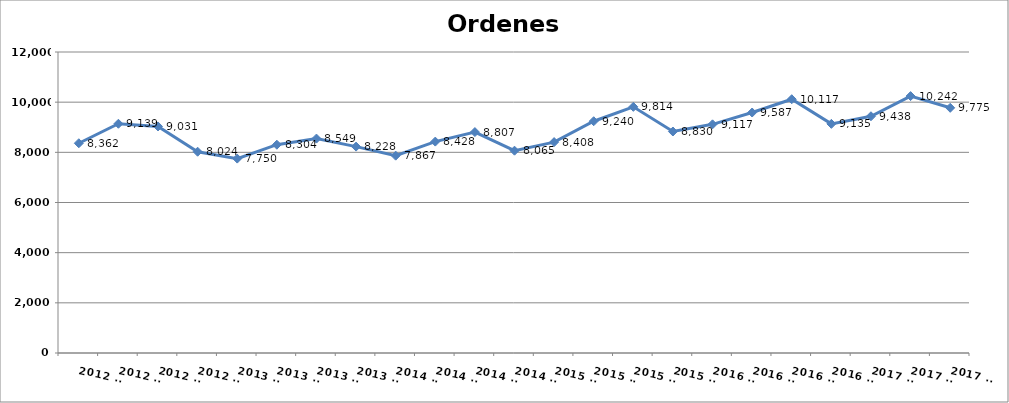
| Category | Ordenes incoadas |
|---|---|
| 2012 T1 | 8362 |
| 2012 T2 | 9139 |
| 2012 T3 | 9031 |
| 2012 T4 | 8024 |
| 2013 T1 | 7750 |
| 2013 T2 | 8304 |
| 2013 T3 | 8549 |
| 2013 T4 | 8228 |
| 2014 T1 | 7867 |
| 2014 T2 | 8428 |
| 2014 T3 | 8807 |
| 2014 T4 | 8065 |
| 2015 T1 | 8408 |
| 2015 T2 | 9240 |
| 2015 T3 | 9814 |
| 2015 T4 | 8830 |
| 2016 T1 | 9117 |
| 2016 T2 | 9587 |
| 2016 T3 | 10117 |
| 2016 T4 | 9135 |
| 2017 T1 | 9438 |
| 2017 T2 | 10242 |
| 2017 T3 | 9775 |